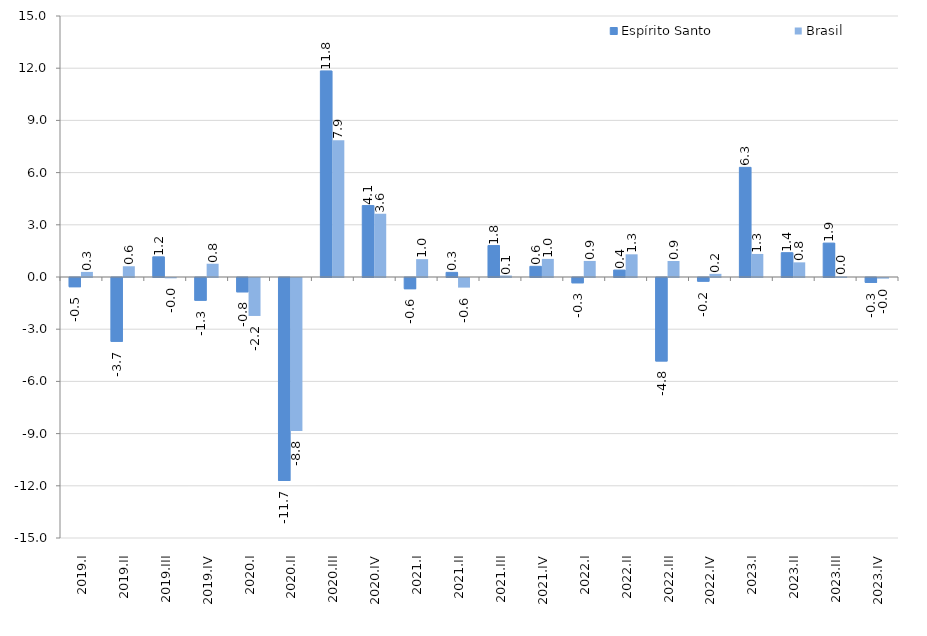
| Category | Espírito Santo | Brasil |
|---|---|---|
| 2019.I | -0.53 | 0.293 |
| 2019.II | -3.671 | 0.618 |
| 2019.III | 1.159 | -0.018 |
| 2019.IV | -1.307 | 0.762 |
| 2020.I | -0.822 | -2.181 |
| 2020.II | -11.664 | -8.794 |
| 2020.III | 11.845 | 7.863 |
| 2020.IV | 4.104 | 3.629 |
| 2021.I | -0.644 | 1.025 |
| 2021.II | 0.266 | -0.552 |
| 2021.III | 1.807 | 0.085 |
| 2021.IV | 0.614 | 1.04 |
| 2022.I | -0.303 | 0.924 |
| 2022.II | 0.399 | 1.304 |
| 2022.III | -4.796 | 0.919 |
| 2022.IV | -0.212 | 0.182 |
| 2023.I | 6.302 | 1.325 |
| 2023.II | 1.398 | 0.841 |
| 2023.III | 1.949 | 0.033 |
| 2023.IV | -0.28 | -0.037 |